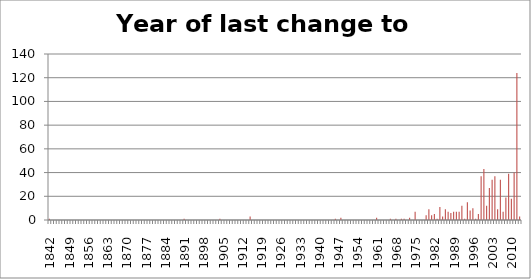
| Category | Number of thresholds |
|---|---|
| 1842.0 | 1 |
| 1843.0 | 0 |
| 1844.0 | 0 |
| 1845.0 | 0 |
| 1846.0 | 0 |
| 1847.0 | 0 |
| 1848.0 | 0 |
| 1849.0 | 0 |
| 1850.0 | 0 |
| 1851.0 | 0 |
| 1852.0 | 0 |
| 1853.0 | 0 |
| 1854.0 | 0 |
| 1855.0 | 0 |
| 1856.0 | 0 |
| 1857.0 | 0 |
| 1858.0 | 0 |
| 1859.0 | 0 |
| 1860.0 | 0 |
| 1861.0 | 0 |
| 1862.0 | 0 |
| 1863.0 | 0 |
| 1864.0 | 0 |
| 1865.0 | 0 |
| 1866.0 | 0 |
| 1867.0 | 0 |
| 1868.0 | 0 |
| 1869.0 | 0 |
| 1870.0 | 0 |
| 1871.0 | 0 |
| 1872.0 | 0 |
| 1873.0 | 0 |
| 1874.0 | 0 |
| 1875.0 | 0 |
| 1876.0 | 0 |
| 1877.0 | 0 |
| 1878.0 | 0 |
| 1879.0 | 0 |
| 1880.0 | 0 |
| 1881.0 | 0 |
| 1882.0 | 0 |
| 1883.0 | 0 |
| 1884.0 | 0 |
| 1885.0 | 0 |
| 1886.0 | 0 |
| 1887.0 | 0 |
| 1888.0 | 0 |
| 1889.0 | 0 |
| 1890.0 | 0 |
| 1891.0 | 1 |
| 1892.0 | 0 |
| 1893.0 | 0 |
| 1894.0 | 0 |
| 1895.0 | 0 |
| 1896.0 | 0 |
| 1897.0 | 0 |
| 1898.0 | 0 |
| 1899.0 | 0 |
| 1900.0 | 0 |
| 1901.0 | 0 |
| 1902.0 | 0 |
| 1903.0 | 0 |
| 1904.0 | 1 |
| 1905.0 | 0 |
| 1906.0 | 0 |
| 1907.0 | 0 |
| 1908.0 | 0 |
| 1909.0 | 0 |
| 1910.0 | 0 |
| 1911.0 | 0 |
| 1912.0 | 0 |
| 1913.0 | 0 |
| 1914.0 | 0 |
| 1915.0 | 3 |
| 1916.0 | 0 |
| 1917.0 | 0 |
| 1918.0 | 0 |
| 1919.0 | 0 |
| 1920.0 | 0 |
| 1921.0 | 0 |
| 1922.0 | 0 |
| 1923.0 | 0 |
| 1924.0 | 0 |
| 1925.0 | 0 |
| 1926.0 | 0 |
| 1927.0 | 0 |
| 1928.0 | 0 |
| 1929.0 | 0 |
| 1930.0 | 0 |
| 1931.0 | 0 |
| 1932.0 | 0 |
| 1933.0 | 0 |
| 1934.0 | 0 |
| 1935.0 | 0 |
| 1936.0 | 0 |
| 1937.0 | 0 |
| 1938.0 | 0 |
| 1939.0 | 0 |
| 1940.0 | 0 |
| 1941.0 | 0 |
| 1942.0 | 0 |
| 1943.0 | 0 |
| 1944.0 | 0 |
| 1945.0 | 0 |
| 1946.0 | 1 |
| 1947.0 | 0 |
| 1948.0 | 2 |
| 1949.0 | 0 |
| 1950.0 | 0 |
| 1951.0 | 0 |
| 1952.0 | 0 |
| 1953.0 | 0 |
| 1954.0 | 0 |
| 1955.0 | 0 |
| 1956.0 | 0 |
| 1957.0 | 0 |
| 1958.0 | 0 |
| 1959.0 | 0 |
| 1960.0 | 0 |
| 1961.0 | 2 |
| 1962.0 | 0 |
| 1963.0 | 0 |
| 1964.0 | 0 |
| 1965.0 | 0 |
| 1966.0 | 1 |
| 1967.0 | 0 |
| 1968.0 | 1 |
| 1969.0 | 0 |
| 1970.0 | 1 |
| 1971.0 | 1 |
| 1972.0 | 0 |
| 1973.0 | 2 |
| 1974.0 | 0 |
| 1975.0 | 7 |
| 1976.0 | 0 |
| 1977.0 | 0 |
| 1978.0 | 0 |
| 1979.0 | 4 |
| 1980.0 | 9 |
| 1981.0 | 4 |
| 1982.0 | 5 |
| 1983.0 | 1 |
| 1984.0 | 11 |
| 1985.0 | 3 |
| 1986.0 | 9 |
| 1987.0 | 7 |
| 1988.0 | 6 |
| 1989.0 | 7 |
| 1990.0 | 7 |
| 1991.0 | 7 |
| 1992.0 | 12 |
| 1993.0 | 1 |
| 1994.0 | 15 |
| 1995.0 | 8 |
| 1996.0 | 10 |
| 1997.0 | 1 |
| 1998.0 | 5 |
| 1999.0 | 37 |
| 2000.0 | 43 |
| 2001.0 | 12 |
| 2002.0 | 27 |
| 2003.0 | 34 |
| 2004.0 | 37 |
| 2005.0 | 9 |
| 2006.0 | 34 |
| 2007.0 | 7 |
| 2008.0 | 19 |
| 2009.0 | 39 |
| 2010.0 | 18 |
| 2011.0 | 40 |
| 2012.0 | 124 |
| 2013.0 | 3 |